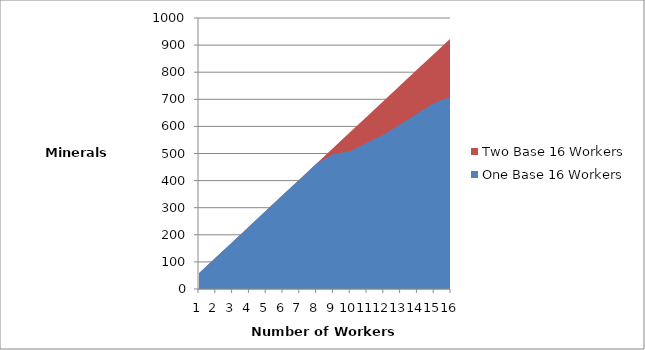
| Category | Two Base 16 Workers | One Base 16 Workers |
|---|---|---|
| 0 | 57.9 | 57.9 |
| 1 | 115.8 | 115.8 |
| 2 | 173.7 | 173.7 |
| 3 | 231.6 | 231.6 |
| 4 | 289.5 | 289.5 |
| 5 | 347.4 | 347.4 |
| 6 | 405.3 | 405.3 |
| 7 | 463.2 | 463.3 |
| 8 | 521.1 | 498 |
| 9 | 579 | 508 |
| 10 | 636.9 | 540 |
| 11 | 694.8 | 570 |
| 12 | 752.7 | 608 |
| 13 | 810.6 | 648 |
| 14 | 868.5 | 686 |
| 15 | 926.4 | 710 |